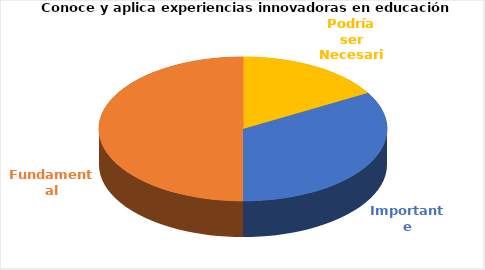
| Category | Series 0 |
|---|---|
| Podría ser Necesaria | 3 |
| Importante | 6 |
| Fundamental | 9 |